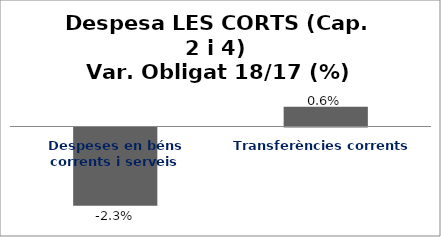
| Category | Series 0 |
|---|---|
| Despeses en béns corrents i serveis | -0.023 |
| Transferències corrents | 0.006 |